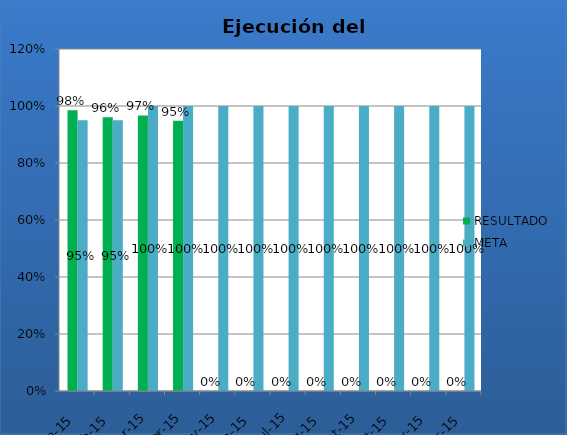
| Category | RESULTADO | META |
|---|---|---|
| ene-15 | 0.985 | 0.95 |
| feb-15 | 0.961 | 0.95 |
| mar-15 | 0.967 | 1 |
| abr-15 | 0.948 | 1 |
| may-15 | 0 | 1 |
| jun-15 | 0 | 1 |
| jul-15 | 0 | 1 |
| ago-15 | 0 | 1 |
| sep-15 | 0 | 1 |
| oct-15 | 0 | 1 |
| nov-15 | 0 | 1 |
| dic-15 | 0 | 1 |